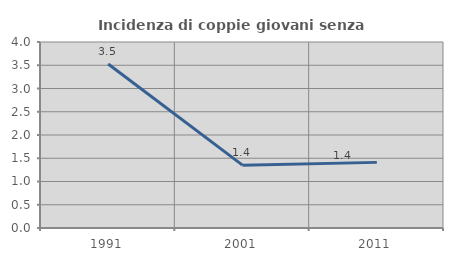
| Category | Incidenza di coppie giovani senza figli |
|---|---|
| 1991.0 | 3.527 |
| 2001.0 | 1.351 |
| 2011.0 | 1.411 |